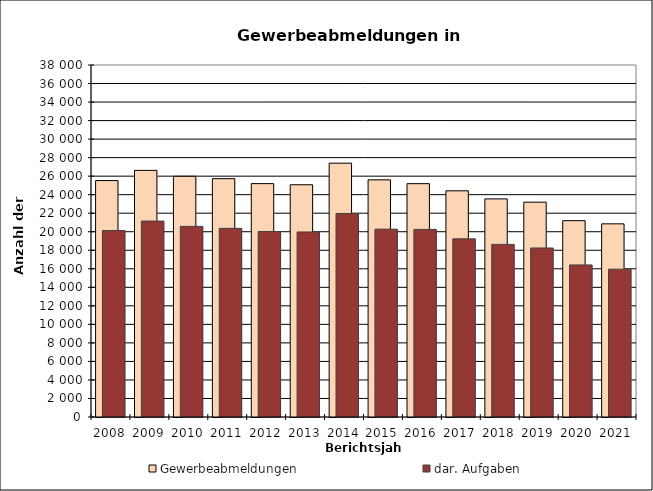
| Category | Gewerbeabmeldungen | dar. Aufgaben |
|---|---|---|
| 2008.0 | 25523 | 20128 |
| 2009.0 | 26623 | 21151 |
| 2010.0 | 25984 | 20578 |
| 2011.0 | 25729 | 20364 |
| 2012.0 | 25195 | 20027 |
| 2013.0 | 25071 | 19975 |
| 2014.0 | 27402 | 21971 |
| 2015.0 | 25601 | 20280 |
| 2016.0 | 25189 | 20252 |
| 2017.0 | 24417 | 19234 |
| 2018.0 | 23545 | 18633 |
| 2019.0 | 23193 | 18245 |
| 2020.0 | 21196 | 16419 |
| 2021.0 | 20853 | 15957 |